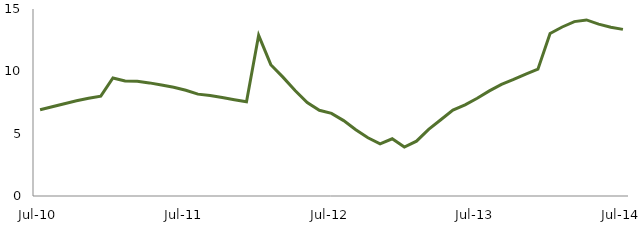
| Category | Series 0 |
|---|---|
| Jul-10 | 6.916 |
|  | 7.153 |
|  | 7.4 |
|  | 7.635 |
|  | 7.833 |
|  | 8.011 |
|  | 9.465 |
|  | 9.221 |
|  | 9.199 |
|  | 9.073 |
|  | 8.902 |
|  | 8.725 |
| Jul-11 | 8.478 |
|  | 8.171 |
|  | 8.061 |
|  | 7.897 |
|  | 7.718 |
|  | 7.555 |
|  | 12.888 |
|  | 10.533 |
|  | 9.535 |
|  | 8.464 |
|  | 7.503 |
|  | 6.876 |
| Jul-12 | 6.627 |
|  | 6.048 |
|  | 5.317 |
|  | 4.667 |
|  | 4.185 |
|  | 4.593 |
|  | 3.923 |
|  | 4.399 |
|  | 5.348 |
|  | 6.118 |
|  | 6.892 |
|  | 7.316 |
| Jul-13 | 7.838 |
|  | 8.434 |
|  | 8.951 |
|  | 9.352 |
|  | 9.785 |
|  | 10.174 |
|  | 13.032 |
|  | 13.557 |
|  | 13.989 |
|  | 14.123 |
|  | 13.79 |
|  | 13.541 |
| Jul-14 | 13.364 |